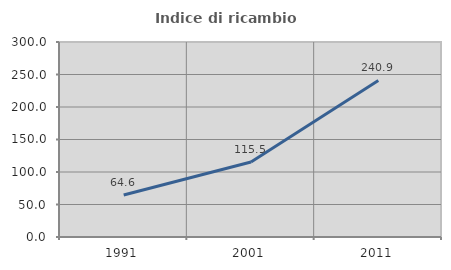
| Category | Indice di ricambio occupazionale  |
|---|---|
| 1991.0 | 64.643 |
| 2001.0 | 115.487 |
| 2011.0 | 240.854 |